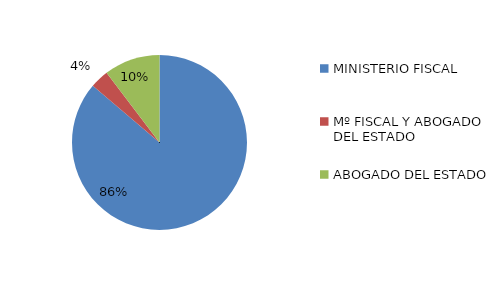
| Category | Series 0 |
|---|---|
| MINISTERIO FISCAL | 50 |
| Mº FISCAL Y ABOGADO DEL ESTADO | 2 |
| ABOGADO DEL ESTADO | 6 |